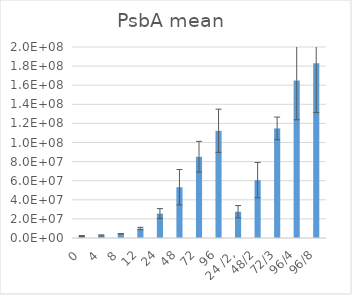
| Category | Series 0 |
|---|---|
| 0 | 2040031.145 |
| 4 | 2735888.75 |
| 8 | 4401938.311 |
| 12 | 9912968.166 |
| 24 | 25511803.887 |
| 48 | 53174251.885 |
| 72 | 85083751.956 |
| 96 | 112291159.562 |
| 24 /2, | 27540269.051 |
| 48/2 | 60597071.682 |
| 72/3 | 114756424.625 |
| 96/4 | 164848082.548 |
| 96/8 | 182999991.606 |